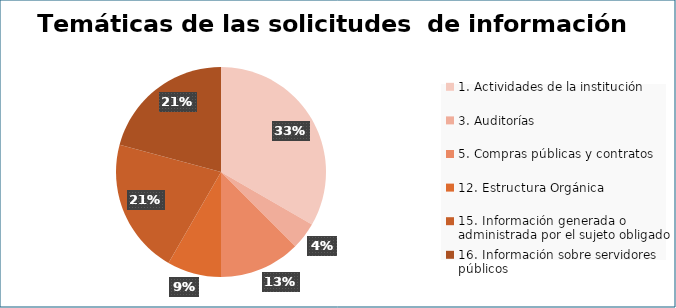
| Category | Temáticas de las solicitudes  de información pública |
|---|---|
| 1. Actividades de la institución  | 8 |
| 3. Auditorías | 1 |
| 5. Compras públicas y contratos | 3 |
| 12. Estructura Orgánica | 2 |
| 15. Información generada o administrada por el sujeto obligado | 5 |
| 16. Información sobre servidores públicos | 5 |